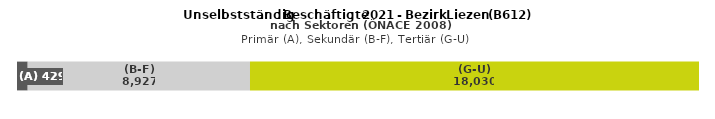
| Category | (A) | (B-F) | (G-U) |
|---|---|---|---|
| 0 | 429 | 8927 | 18030 |